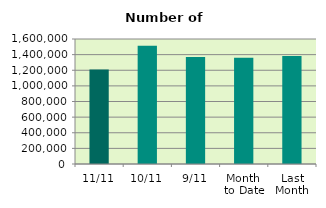
| Category | Series 0 |
|---|---|
| 11/11 | 1210680 |
| 10/11 | 1513386 |
| 9/11 | 1368698 |
| Month 
to Date | 1361202.889 |
| Last
Month | 1383348.571 |